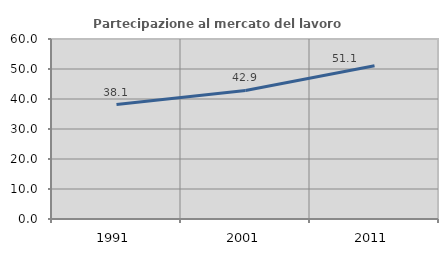
| Category | Partecipazione al mercato del lavoro  femminile |
|---|---|
| 1991.0 | 38.136 |
| 2001.0 | 42.857 |
| 2011.0 | 51.095 |